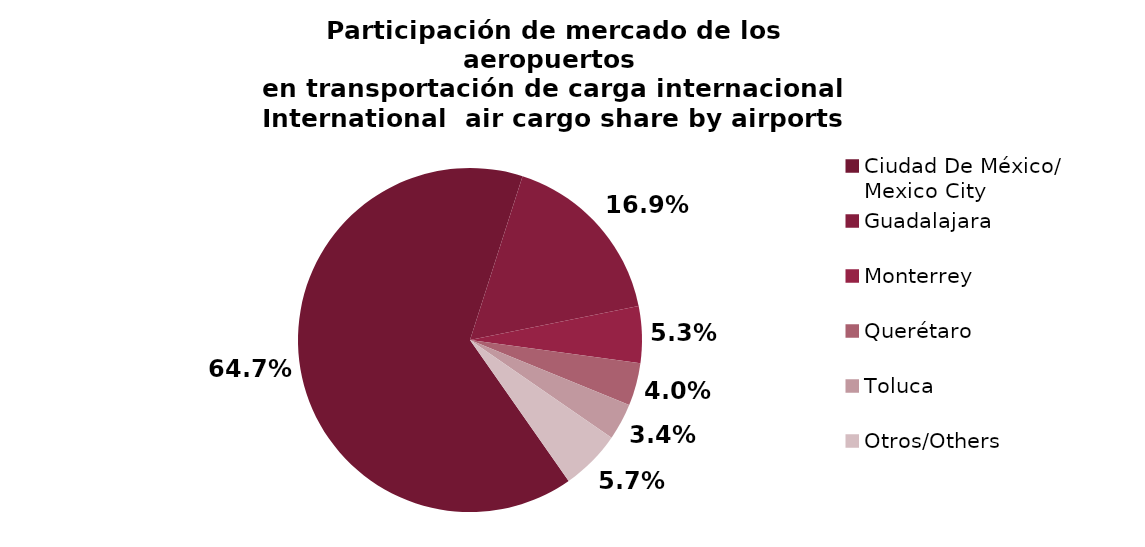
| Category | Series 0 |
|---|---|
| Ciudad De México/
Mexico City | 36429.03 |
| Guadalajara | 9520.227 |
| Monterrey | 2994.657 |
| Querétaro | 2263.086 |
| Toluca | 1938.555 |
| Otros/Others | 3189.81 |